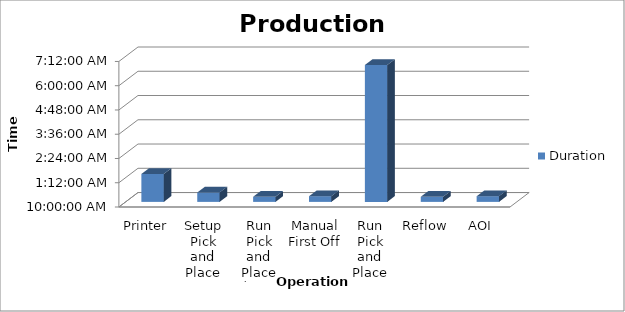
| Category | Duration |
|---|---|
| Printer | 0.058 |
| Setup Pick and Place | 0.019 |
| Run Pick and Place (First Board) | 0.01 |
| Manual First Off | 0.012 |
| Run Pick and Place | 0.282 |
| Reflow | 0.01 |
| AOI | 0.012 |